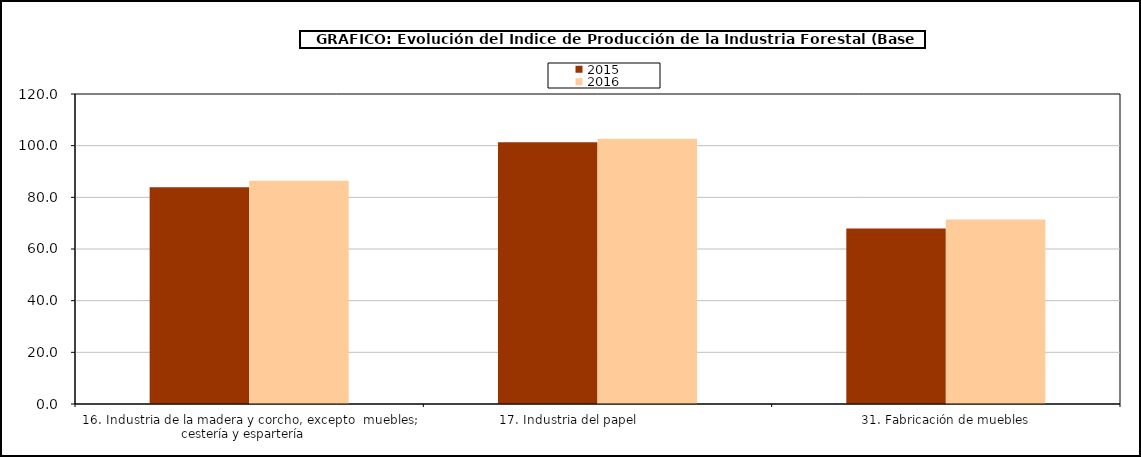
| Category | 2015 | 2016 |
|---|---|---|
| 16. Industria de la madera y corcho, excepto  muebles; cestería y espartería    | 83.888 | 86.465 |
| 17. Industria del papel                | 101.324 | 102.66 |
| 31. Fabricación de muebles | 67.98 | 71.45 |